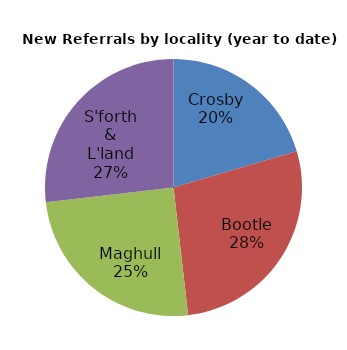
| Category | Series 0 |
|---|---|
| Crosby | 45 |
| Bootle | 61 |
| Maghull | 55 |
| S'forth & L'land | 59 |